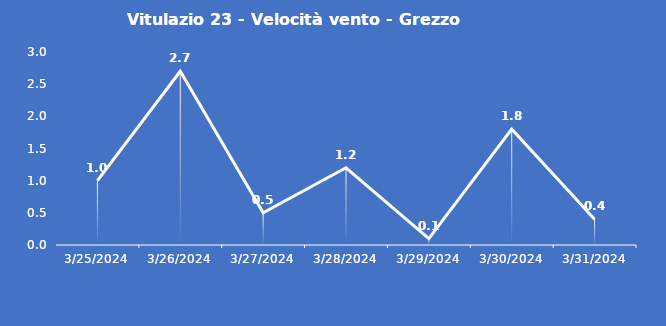
| Category | Vitulazio 23 - Velocità vento - Grezzo (m/s) |
|---|---|
| 3/25/24 | 1 |
| 3/26/24 | 2.7 |
| 3/27/24 | 0.5 |
| 3/28/24 | 1.2 |
| 3/29/24 | 0.1 |
| 3/30/24 | 1.8 |
| 3/31/24 | 0.4 |